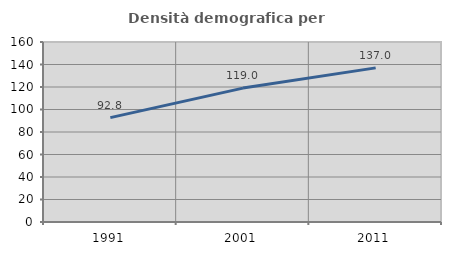
| Category | Densità demografica |
|---|---|
| 1991.0 | 92.757 |
| 2001.0 | 119.024 |
| 2011.0 | 136.986 |